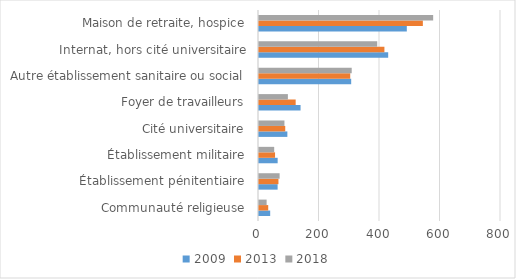
| Category | 2009 | 2013 | 2018 |
|---|---|---|---|
| Communauté religieuse | 36.979 | 30.487 | 25.207 |
| Établissement pénitentiaire | 61.545 | 64.279 | 68.18 |
| Établissement militaire | 61.668 | 53.061 | 50.258 |
| Cité universitaire | 93.746 | 86.757 | 84.108 |
| Foyer de travailleurs | 137.389 | 121.228 | 95.503 |
| Autre établissement sanitaire ou social | 304.756 | 301.586 | 306.484 |
| Internat, hors cité universitaire | 427.064 | 414.601 | 390.826 |
| Maison de retraite, hospice | 488.623 | 541.662 | 575.736 |